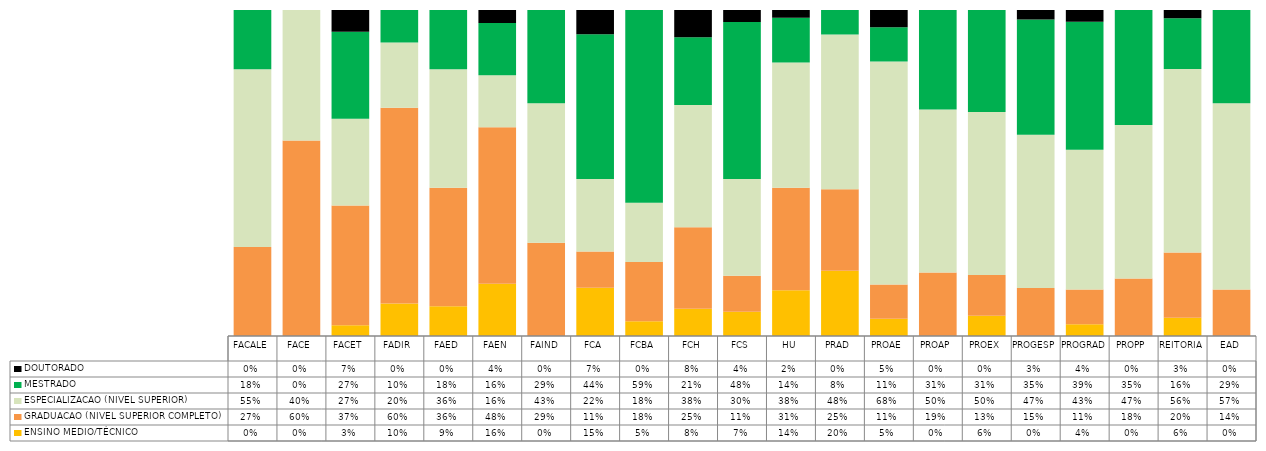
| Category | ENSINO MEDIO/TÉCNICO | GRADUACAO (NIVEL SUPERIOR COMPLETO) | ESPECIALIZACAO (NIVEL SUPERIOR)   | MESTRADO | DOUTORADO                             |
|---|---|---|---|---|---|
| FACALE | 0 | 0.273 | 0.545 | 0.182 | 0 |
| FACE | 0 | 0.6 | 0.4 | 0 | 0 |
| FACET | 0.033 | 0.367 | 0.267 | 0.267 | 0.067 |
| FADIR | 0.1 | 0.6 | 0.2 | 0.1 | 0 |
| FAED | 0.091 | 0.364 | 0.364 | 0.182 | 0 |
| FAEN | 0.16 | 0.48 | 0.16 | 0.16 | 0.04 |
| FAIND | 0 | 0.286 | 0.429 | 0.286 | 0 |
| FCA | 0.148 | 0.111 | 0.222 | 0.444 | 0.074 |
| FCBA | 0.045 | 0.182 | 0.182 | 0.591 | 0 |
| FCH | 0.083 | 0.25 | 0.375 | 0.208 | 0.083 |
| FCS | 0.074 | 0.111 | 0.296 | 0.481 | 0.037 |
| HU | 0.14 | 0.315 | 0.384 | 0.138 | 0.024 |
| PRAD | 0.2 | 0.25 | 0.475 | 0.075 | 0 |
| PROAE | 0.053 | 0.105 | 0.684 | 0.105 | 0.053 |
| PROAP | 0 | 0.194 | 0.5 | 0.306 | 0 |
| PROEX | 0.062 | 0.125 | 0.5 | 0.312 | 0 |
| PROGESP | 0 | 0.147 | 0.471 | 0.353 | 0.029 |
| PROGRAD | 0.036 | 0.107 | 0.429 | 0.393 | 0.036 |
| PROPP | 0 | 0.176 | 0.471 | 0.353 | 0 |
| REITORIA | 0.056 | 0.2 | 0.562 | 0.156 | 0.025 |
| EAD | 0 | 0.143 | 0.571 | 0.286 | 0 |